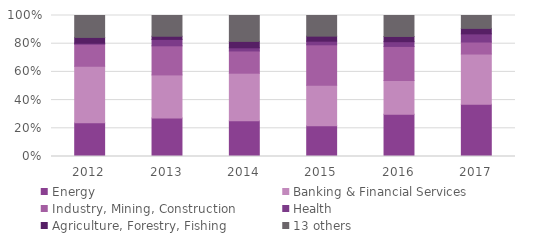
| Category | Energy | Banking & Financial Services | Industry, Mining, Construction | Health | Agriculture, Forestry, Fishing | 13 others |
|---|---|---|---|---|---|---|
| 2012.0 | 0.24 | 0.4 | 0.156 | 0.007 | 0.041 | 0.155 |
| 2013.0 | 0.273 | 0.305 | 0.206 | 0.046 | 0.023 | 0.147 |
| 2014.0 | 0.253 | 0.338 | 0.158 | 0.022 | 0.046 | 0.184 |
| 2015.0 | 0.218 | 0.287 | 0.287 | 0.026 | 0.036 | 0.146 |
| 2016.0 | 0.3 | 0.239 | 0.242 | 0.034 | 0.037 | 0.149 |
| 2017.0 | 0.371 | 0.356 | 0.085 | 0.058 | 0.039 | 0.091 |